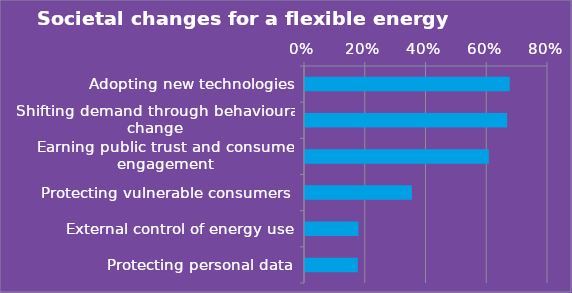
| Category | % of respondents |
|---|---|
| Adopting new technologies | 0.674 |
| Shifting demand through behavioural change | 0.665 |
| Earning public trust and consumer engagement | 0.605 |
| Protecting vulnerable consumers  | 0.352 |
| External control of energy use | 0.176 |
| Protecting personal data | 0.174 |